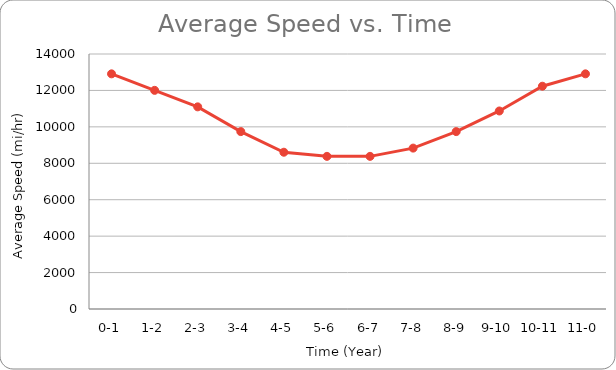
| Category | Series 0 |
|---|---|
| 0-1 | 12910.554 |
| 1-2 | 12004.55 |
| 2-3 | 11098.546 |
| 3-4 | 9739.54 |
| 4-5 | 8607.036 |
| 5-6 | 8380.535 |
| 6-7 | 8380.535 |
| 7-8 | 8833.537 |
| 8-9 | 9739.54 |
| 9-10 | 10872.045 |
| 10-11 | 12231.051 |
| 11-0 | 12910.554 |